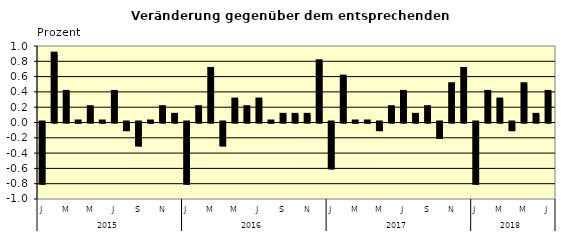
| Category | Series 0 |
|---|---|
| 0 | -0.8 |
| 1 | 0.9 |
| 2 | 0.4 |
| 3 | 0.01 |
| 4 | 0.2 |
| 5 | 0.01 |
| 6 | 0.4 |
| 7 | -0.1 |
| 8 | -0.3 |
| 9 | 0.01 |
| 10 | 0.2 |
| 11 | 0.1 |
| 12 | -0.8 |
| 13 | 0.2 |
| 14 | 0.7 |
| 15 | -0.3 |
| 16 | 0.3 |
| 17 | 0.2 |
| 18 | 0.3 |
| 19 | 0.01 |
| 20 | 0.1 |
| 21 | 0.1 |
| 22 | 0.1 |
| 23 | 0.8 |
| 24 | -0.6 |
| 25 | 0.6 |
| 26 | 0.01 |
| 27 | 0.01 |
| 28 | -0.1 |
| 29 | 0.2 |
| 30 | 0.4 |
| 31 | 0.1 |
| 32 | 0.2 |
| 33 | -0.2 |
| 34 | 0.5 |
| 35 | 0.7 |
| 36 | -0.8 |
| 37 | 0.4 |
| 38 | 0.3 |
| 39 | -0.1 |
| 40 | 0.5 |
| 41 | 0.1 |
| 42 | 0.4 |